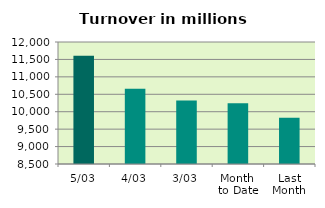
| Category | Series 0 |
|---|---|
| 5/03 | 11608.111 |
| 4/03 | 10656.76 |
| 3/03 | 10323.109 |
| Month 
to Date | 10244.667 |
| Last
Month | 9824.278 |